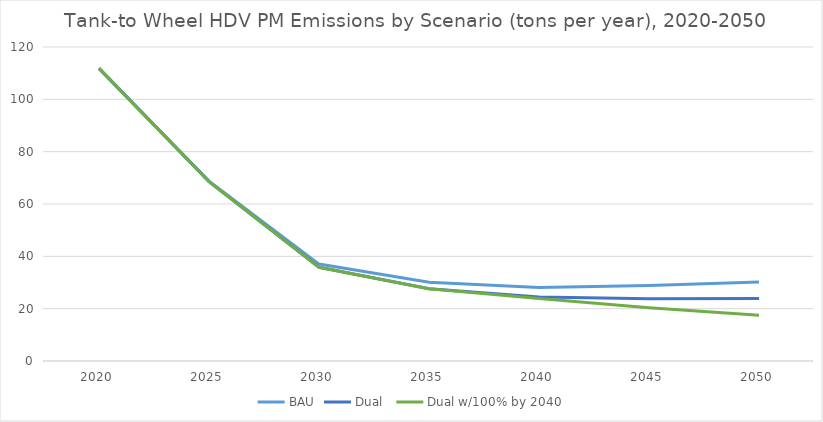
| Category | BAU | Dual  | Dual w/100% by 2040 |
|---|---|---|---|
| 2020.0 | 111.833 | 111.833 | 111.833 |
| 2025.0 | 68.754 | 68.567 | 68.567 |
| 2030.0 | 37.034 | 35.814 | 35.814 |
| 2035.0 | 30.118 | 27.637 | 27.637 |
| 2040.0 | 28.106 | 24.491 | 23.907 |
| 2045.0 | 28.894 | 23.83 | 20.355 |
| 2050.0 | 30.172 | 23.92 | 17.478 |